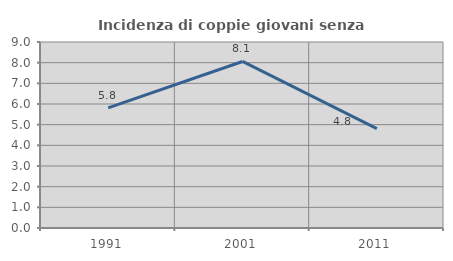
| Category | Incidenza di coppie giovani senza figli |
|---|---|
| 1991.0 | 5.815 |
| 2001.0 | 8.058 |
| 2011.0 | 4.812 |